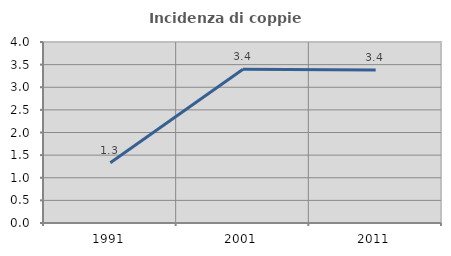
| Category | Incidenza di coppie miste |
|---|---|
| 1991.0 | 1.332 |
| 2001.0 | 3.398 |
| 2011.0 | 3.381 |